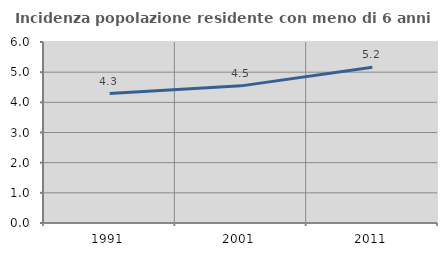
| Category | Incidenza popolazione residente con meno di 6 anni |
|---|---|
| 1991.0 | 4.289 |
| 2001.0 | 4.546 |
| 2011.0 | 5.161 |